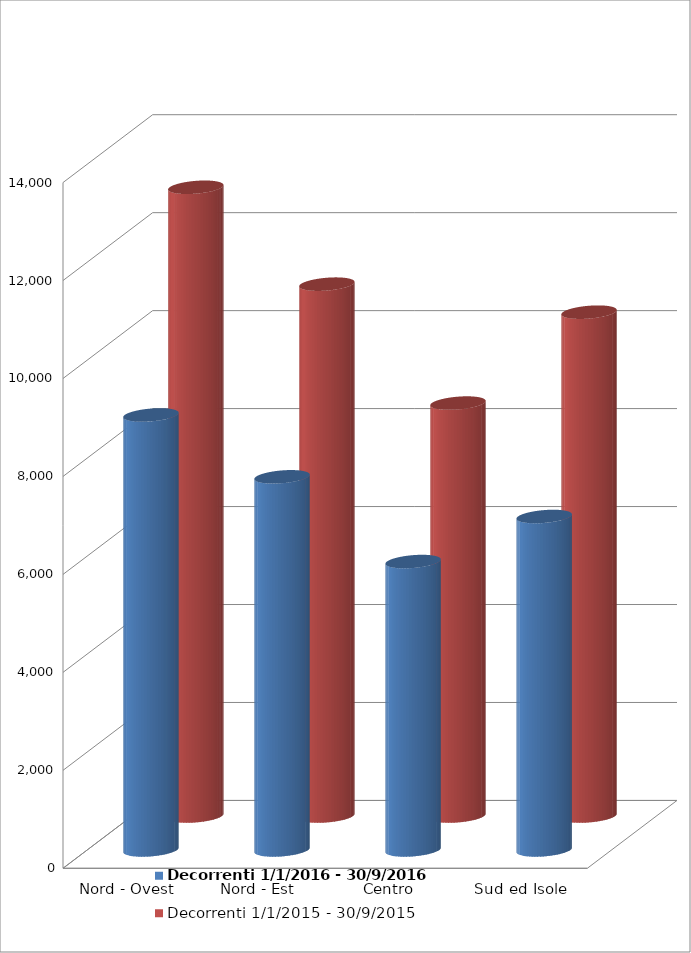
| Category | Decorrenti 1/1/2016 - 30/9/2016 | Decorrenti 1/1/2015 - 30/9/2015 |
|---|---|---|
| Nord - Ovest | 8881 | 12837 |
| Nord - Est | 7618 | 10859 |
| Centro | 5888 | 8431 |
| Sud ed Isole | 6808 | 10287 |